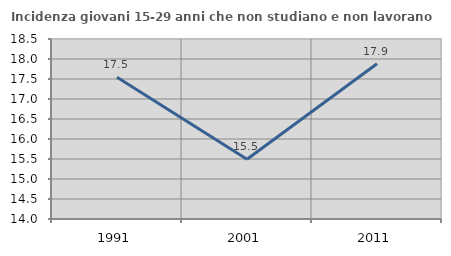
| Category | Incidenza giovani 15-29 anni che non studiano e non lavorano  |
|---|---|
| 1991.0 | 17.544 |
| 2001.0 | 15.493 |
| 2011.0 | 17.883 |